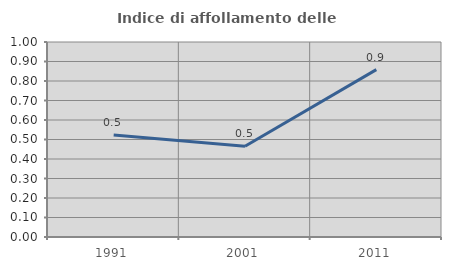
| Category | Indice di affollamento delle abitazioni  |
|---|---|
| 1991.0 | 0.524 |
| 2001.0 | 0.465 |
| 2011.0 | 0.858 |